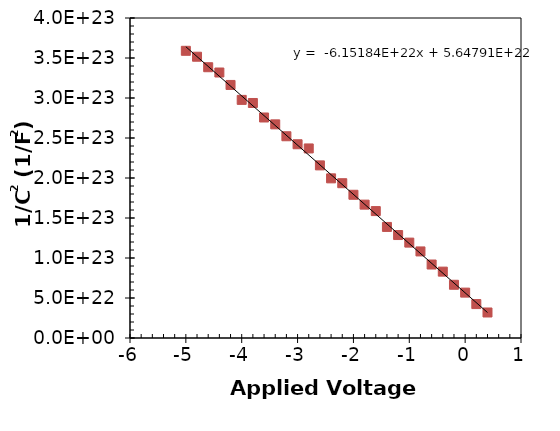
| Category | Series 1 |
|---|---|
| -5.0 | 359001315404861770039296 |
| -4.8 | 351585565923495630602240 |
| -4.6 | 338463770099106736766976 |
| -4.4 | 331867042215072817479680 |
| -4.2 | 316326753652867866820608 |
| -4.0 | 297653700758298244939776 |
| -3.8 | 293769471037288608694272 |
| -3.6 | 275635103053607218446336 |
| -3.4 | 267063321960189710565376 |
| -3.2 | 252178267525407441944576 |
| -3.0 | 242180406474469325930496 |
| -2.8 | 236952475280240816422912 |
| -2.6 | 215773275220263328284672 |
| -2.4 | 199564906548212659126272 |
| -2.2 | 193476698729522478972928 |
| -2.0 | 179031642977006228865024 |
| -1.8 | 166711537521503504433152 |
| -1.6 | 158642713573681258299392 |
| -1.4 | 138839005104405909340160 |
| -1.2 | 128698585729558776905728 |
| -1.0 | 119228860891532797935616 |
| -0.8 | 108207727579546511212544 |
| -0.6 | 91851892134499821027328 |
| -0.4 | 82954745608569542934528 |
| -0.2 | 66540519610542039498752 |
| 0.0 | 56720053095129241616384 |
| 0.2 | 42402348274943503892480 |
| 0.4 | 31877810236941282574336 |